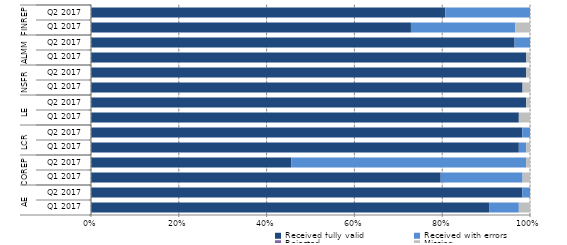
| Category | Received fully valid | Received with errors | Rejected | Missing |
|---|---|---|---|---|
| 0 | 107 | 8 | 0 | 3 |
| 1 | 112 | 2 | 0 | 0 |
| 2 | 94 | 22 | 0 | 2 |
| 3 | 52 | 61 | 0 | 1 |
| 4 | 115 | 2 | 0 | 1 |
| 5 | 112 | 2 | 0 | 0 |
| 6 | 115 | 0 | 0 | 3 |
| 7 | 113 | 0 | 0 | 1 |
| 8 | 116 | 0 | 0 | 2 |
| 9 | 113 | 0 | 0 | 1 |
| 10 | 117 | 0 | 0 | 1 |
| 11 | 110 | 4 | 0 | 0 |
| 12 | 86 | 28 | 0 | 4 |
| 13 | 92 | 22 | 0 | 0 |